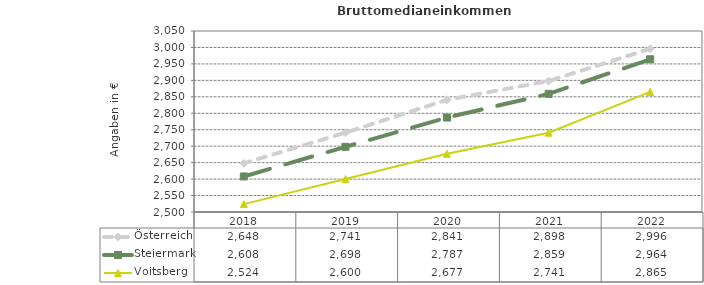
| Category | Österreich | Steiermark | Voitsberg |
|---|---|---|---|
| 2022.0 | 2996 | 2964 | 2865 |
| 2021.0 | 2898 | 2859 | 2741 |
| 2020.0 | 2841 | 2787 | 2677 |
| 2019.0 | 2741 | 2698 | 2600 |
| 2018.0 | 2648 | 2608 | 2524 |